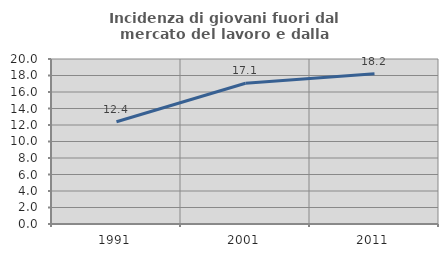
| Category | Incidenza di giovani fuori dal mercato del lavoro e dalla formazione  |
|---|---|
| 1991.0 | 12.398 |
| 2001.0 | 17.067 |
| 2011.0 | 18.219 |